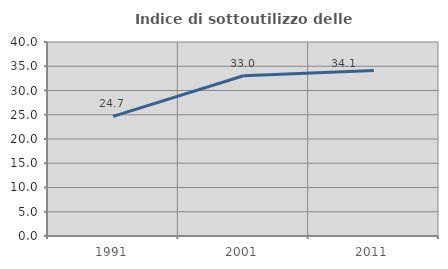
| Category | Indice di sottoutilizzo delle abitazioni  |
|---|---|
| 1991.0 | 24.667 |
| 2001.0 | 33.048 |
| 2011.0 | 34.121 |